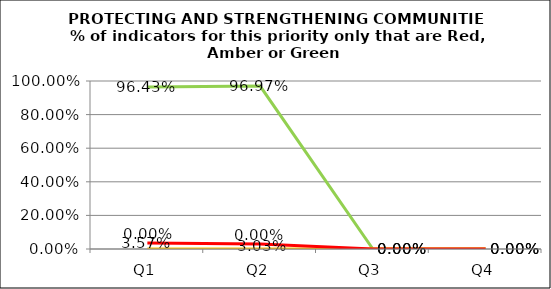
| Category | Green | Amber | Red |
|---|---|---|---|
| Q1 | 0.964 | 0 | 0.036 |
| Q2 | 0.97 | 0 | 0.03 |
| Q3 | 0 | 0 | 0 |
| Q4 | 0 | 0 | 0 |